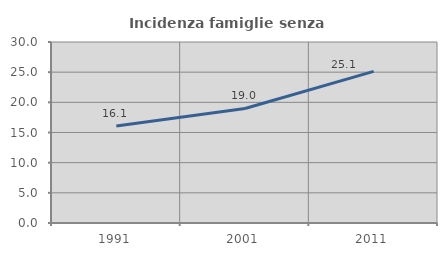
| Category | Incidenza famiglie senza nuclei |
|---|---|
| 1991.0 | 16.075 |
| 2001.0 | 18.984 |
| 2011.0 | 25.123 |